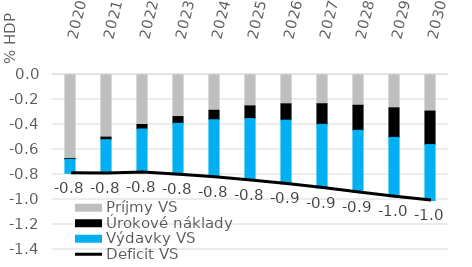
| Category | Príjmy VS | Úrokové náklady | Výdavky VS |
|---|---|---|---|
| 2020.0 | -0.672 | -0.007 | -0.112 |
| 2021.0 | -0.501 | -0.021 | -0.271 |
| 2022.0 | -0.4 | -0.036 | -0.348 |
| 2023.0 | -0.337 | -0.054 | -0.411 |
| 2024.0 | -0.286 | -0.076 | -0.461 |
| 2025.0 | -0.251 | -0.101 | -0.495 |
| 2026.0 | -0.235 | -0.131 | -0.511 |
| 2027.0 | -0.234 | -0.164 | -0.51 |
| 2028.0 | -0.246 | -0.2 | -0.497 |
| 2029.0 | -0.267 | -0.236 | -0.475 |
| 2030.0 | -0.293 | -0.268 | -0.448 |